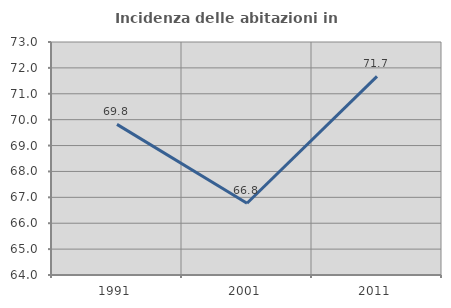
| Category | Incidenza delle abitazioni in proprietà  |
|---|---|
| 1991.0 | 69.818 |
| 2001.0 | 66.771 |
| 2011.0 | 71.671 |